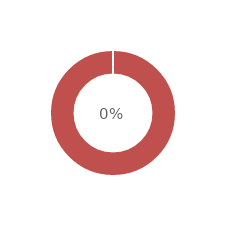
| Category | 0% |
|---|---|
| 0 | 0 |
| 1 | 1 |